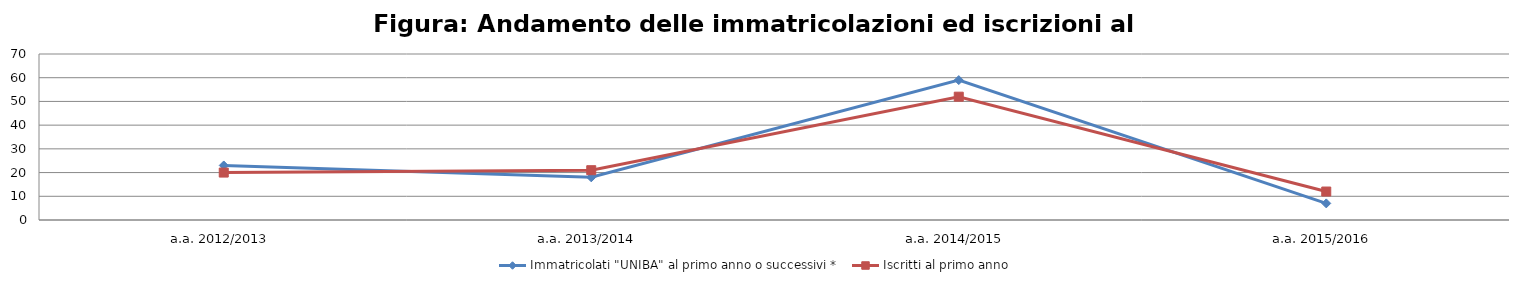
| Category | Immatricolati "UNIBA" al primo anno o successivi * | Iscritti al primo anno  |
|---|---|---|
| a.a. 2012/2013 | 23 | 20 |
| a.a. 2013/2014 | 18 | 21 |
| a.a. 2014/2015 | 59 | 52 |
| a.a. 2015/2016 | 7 | 12 |